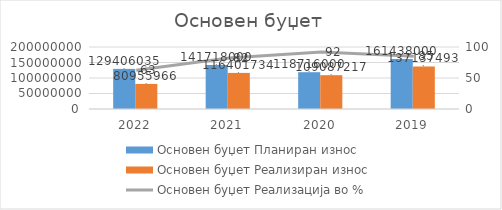
| Category | Основен буџет Планиран износ | Основен буџет Реализиран износ |
|---|---|---|
| 2022.0 | 129406035 | 80955966 |
| 2021.0 | 141718000 | 116401734 |
| 2020.0 | 118716000 | 109087217 |
| 2019.0 | 161438000 | 137137493 |